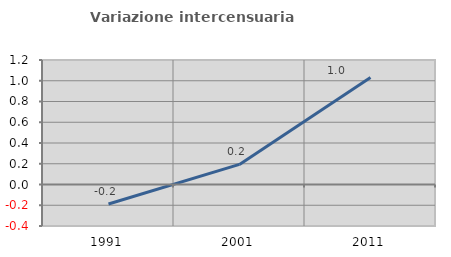
| Category | Variazione intercensuaria annua |
|---|---|
| 1991.0 | -0.188 |
| 2001.0 | 0.194 |
| 2011.0 | 1.032 |